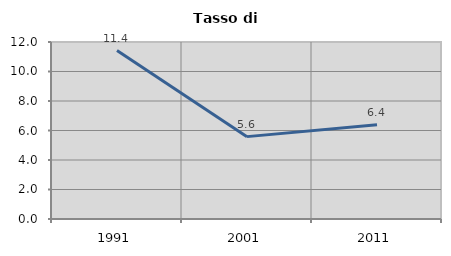
| Category | Tasso di disoccupazione   |
|---|---|
| 1991.0 | 11.419 |
| 2001.0 | 5.585 |
| 2011.0 | 6.383 |